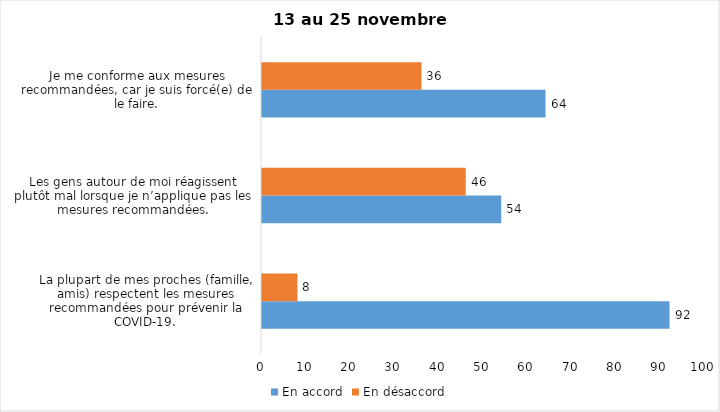
| Category | En accord | En désaccord |
|---|---|---|
| La plupart de mes proches (famille, amis) respectent les mesures recommandées pour prévenir la COVID-19. | 92 | 8 |
| Les gens autour de moi réagissent plutôt mal lorsque je n’applique pas les mesures recommandées. | 54 | 46 |
| Je me conforme aux mesures recommandées, car je suis forcé(e) de le faire. | 64 | 36 |